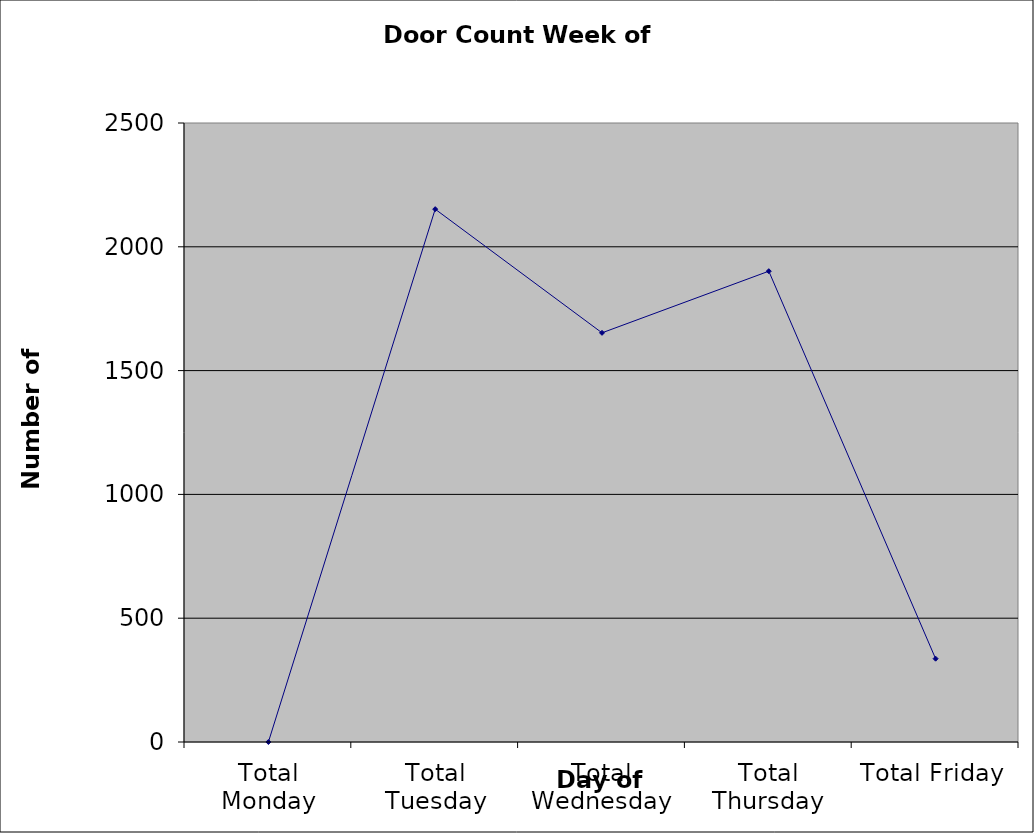
| Category | Series 0 |
|---|---|
| Total Monday | 0 |
| Total Tuesday | 2152 |
| Total Wednesday | 1652.5 |
| Total Thursday | 1901.5 |
| Total Friday | 336.5 |